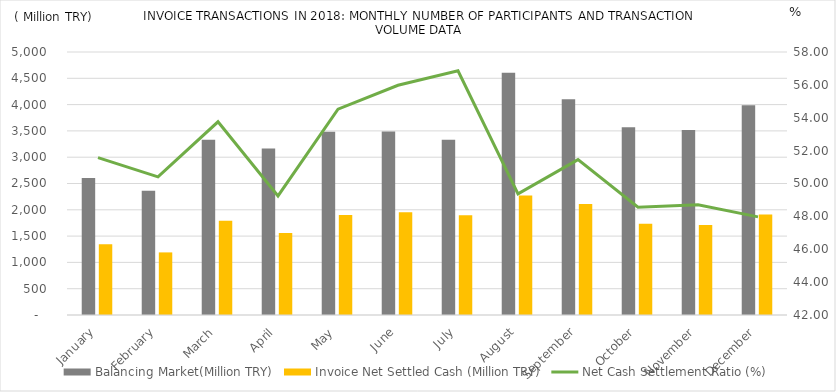
| Category | Balancing Market(Million TRY) | Invoice Net Settled Cash (Million TRY) |
|---|---|---|
| January | 2604 | 1343 |
| February | 2361 | 1190 |
| March | 3330 | 1790 |
| April | 3164 | 1558 |
| May | 3485 | 1900 |
| June | 3489 | 1953 |
| July | 3333 | 1895 |
| August | 4604 | 2273 |
| September | 4103 | 2111 |
| October | 3571 | 1734 |
| November | 3515 | 1712 |
| December | 3986 | 1912 |